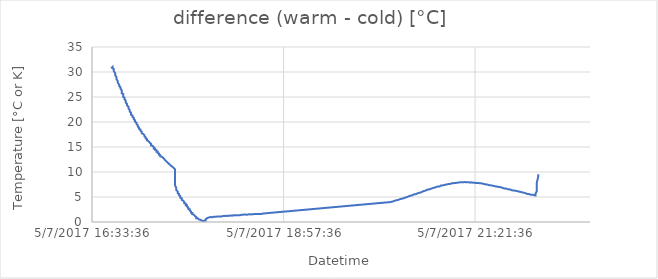
| Category | difference (warm - cold) [°C] |
|---|---|
| 42921.7 | 30.75 |
| 42921.700694444444 | 31 |
| 42921.700694444444 | 31 |
| 42921.700694444444 | 30.94 |
| 42921.700694444444 | 30.75 |
| 42921.70138888889 | 30.62 |
| 42921.70138888889 | 30.56 |
| 42921.70138888889 | 30.19 |
| 42921.70138888889 | 30 |
| 42921.70208333333 | 29.75 |
| 42921.70208333333 | 29.56 |
| 42921.70208333333 | 29.37 |
| 42921.70208333333 | 29.19 |
| 42921.70277777778 | 28.94 |
| 42921.70277777778 | 28.81 |
| 42921.70277777778 | 28.56 |
| 42921.70277777778 | 28.38 |
| 42921.70347222222 | 28.19 |
| 42921.70347222222 | 28 |
| 42921.70347222222 | 27.87 |
| 42921.70347222222 | 27.69 |
| 42921.70416666667 | 27.44 |
| 42921.70416666667 | 27.37 |
| 42921.70416666667 | 27.19 |
| 42921.70486111111 | 26.94 |
| 42921.70486111111 | 26.87 |
| 42921.70486111111 | 26.69 |
| 42921.70486111111 | 26.5 |
| 42921.705555555556 | 26.31 |
| 42921.705555555556 | 26.06 |
| 42921.705555555556 | 25.88 |
| 42921.705555555556 | 25.75 |
| 42921.70625 | 25.62 |
| 42921.70625 | 25.31 |
| 42921.70625 | 25.12 |
| 42921.70625 | 25 |
| 42921.70694444444 | 24.87 |
| 42921.70694444444 | 24.75 |
| 42921.70694444444 | 24.56 |
| 42921.70694444444 | 24.37 |
| 42921.70763888889 | 24.25 |
| 42921.70763888889 | 24.06 |
| 42921.70763888889 | 23.87 |
| 42921.70763888889 | 23.81 |
| 42921.708333333336 | 23.62 |
| 42921.708333333336 | 23.5 |
| 42921.708333333336 | 23.31 |
| 42921.708333333336 | 23.25 |
| 42921.709027777775 | 23.06 |
| 42921.709027777775 | 22.87 |
| 42921.709027777775 | 22.75 |
| 42921.709027777775 | 22.56 |
| 42921.70972222222 | 22.37 |
| 42921.70972222222 | 22.19 |
| 42921.70972222222 | 22.06 |
| 42921.71041666667 | 21.87 |
| 42921.71041666667 | 21.75 |
| 42921.71041666667 | 21.69 |
| 42921.71041666667 | 21.44 |
| 42921.71111111111 | 21.31 |
| 42921.71111111111 | 21.25 |
| 42921.71111111111 | 21.12 |
| 42921.71111111111 | 21 |
| 42921.711805555555 | 20.88 |
| 42921.711805555555 | 20.75 |
| 42921.711805555555 | 20.56 |
| 42921.711805555555 | 20.5 |
| 42921.7125 | 20.31 |
| 42921.7125 | 20.19 |
| 42921.7125 | 20.06 |
| 42921.7125 | 19.94 |
| 42921.71319444444 | 19.87 |
| 42921.71319444444 | 19.75 |
| 42921.71319444444 | 19.62 |
| 42921.71319444444 | 19.5 |
| 42921.71388888889 | 19.37 |
| 42921.71388888889 | 19.19 |
| 42921.71388888889 | 19.12 |
| 42921.71388888889 | 19 |
| 42921.714583333334 | 18.87 |
| 42921.714583333334 | 18.81 |
| 42921.714583333334 | 18.62 |
| 42921.714583333334 | 18.56 |
| 42921.71527777778 | 18.5 |
| 42921.71527777778 | 18.37 |
| 42921.71527777778 | 18.25 |
| 42921.71527777778 | 18.12 |
| 42921.71597222222 | 18.06 |
| 42921.71597222222 | 17.94 |
| 42921.71597222222 | 17.87 |
| 42921.71597222222 | 17.75 |
| 42921.71666666667 | 17.62 |
| 42921.71666666667 | 17.56 |
| 42921.71666666667 | 17.44 |
| 42921.717361111114 | 17.37 |
| 42921.717361111114 | 17.25 |
| 42921.717361111114 | 17.12 |
| 42921.717361111114 | 17.06 |
| 42921.71805555555 | 16.94 |
| 42921.71805555555 | 16.81 |
| 42921.71805555555 | 16.69 |
| 42921.71805555555 | 16.62 |
| 42921.71875 | 16.56 |
| 42921.71875 | 16.44 |
| 42921.71875 | 16.37 |
| 42921.71875 | 16.31 |
| 42921.71944444445 | 16.19 |
| 42921.71944444445 | 16.12 |
| 42921.71944444445 | 16.06 |
| 42921.71944444445 | 16 |
| 42921.720138888886 | 15.88 |
| 42921.720138888886 | 15.81 |
| 42921.720138888886 | 15.75 |
| 42921.720138888886 | 15.69 |
| 42921.72083333333 | 15.63 |
| 42921.72083333333 | 15.5 |
| 42921.72083333333 | 15.44 |
| 42921.72083333333 | 15.31 |
| 42921.72152777778 | 15.25 |
| 42921.72152777778 | 15.19 |
| 42921.72152777778 | 15.13 |
| 42921.72222222222 | 15 |
| 42921.72222222222 | 14.94 |
| 42921.72222222222 | 14.87 |
| 42921.72222222222 | 14.69 |
| 42921.722916666666 | 14.69 |
| 42921.722916666666 | 14.56 |
| 42921.722916666666 | 14.56 |
| 42921.722916666666 | 14.44 |
| 42921.72361111111 | 14.38 |
| 42921.72361111111 | 14.25 |
| 42921.72361111111 | 14.25 |
| 42921.72361111111 | 14.06 |
| 42921.72430555556 | 14.06 |
| 42921.72430555556 | 13.94 |
| 42921.72430555556 | 13.88 |
| 42921.72430555556 | 13.81 |
| 42921.725 | 13.69 |
| 42921.725 | 13.62 |
| 42921.725 | 13.56 |
| 42921.725 | 13.44 |
| 42921.725694444445 | 13.38 |
| 42921.725694444445 | 13.31 |
| 42921.725694444445 | 13.25 |
| 42921.725694444445 | 13.13 |
| 42921.72638888889 | 13.06 |
| 42921.72638888889 | 13 |
| 42921.72638888889 | 12.94 |
| 42921.72708333333 | 12.88 |
| 42921.72708333333 | 12.75 |
| 42921.72708333333 | 12.75 |
| 42921.72708333333 | 12.69 |
| 42921.72777777778 | 12.56 |
| 42921.72777777778 | 12.5 |
| 42921.72777777778 | 12.44 |
| 42921.72777777778 | 12.37 |
| 42921.728472222225 | 12.25 |
| 42921.728472222225 | 12.19 |
| 42921.728472222225 | 12.19 |
| 42921.728472222225 | 12.06 |
| 42921.729166666664 | 12 |
| 42921.729166666664 | 11.94 |
| 42921.729166666664 | 11.88 |
| 42921.729166666664 | 11.81 |
| 42921.72986111111 | 11.75 |
| 42921.72986111111 | 11.63 |
| 42921.72986111111 | 11.63 |
| 42921.72986111111 | 11.56 |
| 42921.73055555556 | 11.5 |
| 42921.73055555556 | 11.44 |
| 42921.73055555556 | 11.44 |
| 42921.73055555556 | 11.31 |
| 42921.73125 | 11.25 |
| 42921.73125 | 11.19 |
| 42921.73125 | 11.12 |
| 42921.73125 | 11.12 |
| 42921.731944444444 | 11.06 |
| 42921.731944444444 | 10.94 |
| 42921.731944444444 | 10.88 |
| 42921.73263888889 | 10.81 |
| 42921.73263888889 | 10.75 |
| 42921.73263888889 | 10.69 |
| 42921.73263888889 | 10.63 |
| 42921.73333333333 | 10.56 |
| 42921.73333333333 | 10.44 |
| 42921.73333333333 | 10.25 |
| 42921.73333333333 | 7.37 |
| 42921.73402777778 | 6.75 |
| 42921.73402777778 | 6.56 |
| 42921.73402777778 | 6.37 |
| 42921.73402777778 | 6.25 |
| 42921.73472222222 | 6.12 |
| 42921.73472222222 | 6 |
| 42921.73472222222 | 5.94 |
| 42921.73472222222 | 5.75 |
| 42921.73541666667 | 5.62 |
| 42921.73541666667 | 5.5 |
| 42921.73541666667 | 5.37 |
| 42921.73541666667 | 5.31 |
| 42921.73611111111 | 5.19 |
| 42921.73611111111 | 5.06 |
| 42921.73611111111 | 5 |
| 42921.73611111111 | 4.87 |
| 42921.736805555556 | 4.75 |
| 42921.736805555556 | 4.62 |
| 42921.736805555556 | 4.56 |
| 42921.736805555556 | 4.44 |
| 42921.7375 | 4.31 |
| 42921.7375 | 4.25 |
| 42921.7375 | 4.12 |
| 42921.73819444444 | 4 |
| 42921.73819444444 | 3.94 |
| 42921.73819444444 | 3.81 |
| 42921.73819444444 | 3.75 |
| 42921.73888888889 | 3.69 |
| 42921.73888888889 | 3.62 |
| 42921.73888888889 | 3.5 |
| 42921.73888888889 | 3.37 |
| 42921.739583333336 | 3.37 |
| 42921.739583333336 | 3.25 |
| 42921.739583333336 | 3.12 |
| 42921.739583333336 | 3 |
| 42921.740277777775 | 2.87 |
| 42921.740277777775 | 2.81 |
| 42921.740277777775 | 2.69 |
| 42921.740277777775 | 2.62 |
| 42921.74097222222 | 2.56 |
| 42921.74097222222 | 2.44 |
| 42921.74097222222 | 2.31 |
| 42921.74097222222 | 2.19 |
| 42921.74166666667 | 2.12 |
| 42921.74166666667 | 2.06 |
| 42921.74166666667 | 2 |
| 42921.74166666667 | 1.87 |
| 42921.74236111111 | 1.81 |
| 42921.74236111111 | 1.69 |
| 42921.74236111111 | 1.69 |
| 42921.74236111111 | 1.56 |
| 42921.743055555555 | 1.5 |
| 42921.743055555555 | 1.44 |
| 42921.743055555555 | 1.31 |
| 42921.74375 | 1.19 |
| 42921.74375 | 1.19 |
| 42921.74375 | 1.12 |
| 42921.74375 | 1.06 |
| 42921.74444444444 | 1 |
| 42921.74444444444 | 0.94 |
| 42921.74444444444 | 0.88 |
| 42921.74444444444 | 0.75 |
| 42921.74513888889 | 0.75 |
| 42921.74513888889 | 0.69 |
| 42921.74513888889 | 0.69 |
| 42921.74513888889 | 0.56 |
| 42921.745833333334 | 0.5 |
| 42921.745833333334 | 0.56 |
| 42921.745833333334 | 0.5 |
| 42921.745833333334 | 0.44 |
| 42921.74652777778 | 0.44 |
| 42921.74652777778 | 0.37 |
| 42921.74652777778 | 0.37 |
| 42921.74652777778 | 0.37 |
| 42921.74722222222 | 0.31 |
| 42921.74722222222 | 0.25 |
| 42921.74722222222 | 0.25 |
| 42921.74722222222 | 0.25 |
| 42921.74791666667 | 0.19 |
| 42921.74791666667 | 0.19 |
| 42921.74791666667 | 0.25 |
| 42921.74791666667 | 0.25 |
| 42921.748611111114 | 0.25 |
| 42921.748611111114 | 0.25 |
| 42921.748611111114 | 0.25 |
| 42921.748611111114 | 0.25 |
| 42921.74930555555 | 0.25 |
| 42921.74930555555 | 0.37 |
| 42921.74930555555 | 0.5 |
| 42921.74930555555 | 0.62 |
| 42921.75 | 0.75 |
| 42921.75 | 0.81 |
| 42921.75 | 0.81 |
| 42921.75 | 0.88 |
| 42921.75069444445 | 0.88 |
| 42921.75069444445 | 0.88 |
| 42921.75069444445 | 0.94 |
| 42921.751388888886 | 0.94 |
| 42921.751388888886 | 0.94 |
| 42921.751388888886 | 1 |
| 42921.751388888886 | 0.94 |
| 42921.75208333333 | 1 |
| 42921.75208333333 | 1 |
| 42921.75208333333 | 1 |
| 42921.75208333333 | 1 |
| 42921.75277777778 | 0.94 |
| 42921.75277777778 | 1 |
| 42921.75277777778 | 1 |
| 42921.75277777778 | 1 |
| 42921.75347222222 | 1.06 |
| 42921.75347222222 | 1 |
| 42921.75347222222 | 1 |
| 42921.75347222222 | 1 |
| 42921.754166666666 | 1.06 |
| 42921.754166666666 | 1.06 |
| 42921.754166666666 | 1.06 |
| 42921.754166666666 | 1.06 |
| 42921.75486111111 | 1.06 |
| 42921.75486111111 | 1.06 |
| 42921.75486111111 | 1.06 |
| 42921.75486111111 | 1.12 |
| 42921.75555555556 | 1.12 |
| 42921.75555555556 | 1.12 |
| 42921.75555555556 | 1.12 |
| 42921.75625 | 1.12 |
| 42921.75625 | 1.12 |
| 42921.75625 | 1.12 |
| 42921.75625 | 1.19 |
| 42921.756944444445 | 1.12 |
| 42921.756944444445 | 1.19 |
| 42921.756944444445 | 1.19 |
| 42921.756944444445 | 1.19 |
| 42921.75763888889 | 1.12 |
| 42921.75763888889 | 1.12 |
| 42921.75763888889 | 1.19 |
| 42921.75763888889 | 1.19 |
| 42921.75833333333 | 1.19 |
| 42921.75833333333 | 1.19 |
| 42921.75833333333 | 1.19 |
| 42921.75833333333 | 1.19 |
| 42921.75902777778 | 1.19 |
| 42921.75902777778 | 1.19 |
| 42921.75902777778 | 1.19 |
| 42921.75902777778 | 1.25 |
| 42921.759722222225 | 1.25 |
| 42921.759722222225 | 1.25 |
| 42921.759722222225 | 1.19 |
| 42921.759722222225 | 1.25 |
| 42921.760416666664 | 1.19 |
| 42921.760416666664 | 1.19 |
| 42921.760416666664 | 1.31 |
| 42921.760416666664 | 1.25 |
| 42921.76111111111 | 1.25 |
| 42921.76111111111 | 1.25 |
| 42921.76111111111 | 1.25 |
| 42921.76111111111 | 1.25 |
| 42921.76180555556 | 1.25 |
| 42921.76180555556 | 1.25 |
| 42921.76180555556 | 1.31 |
| 42921.76180555556 | 1.31 |
| 42921.7625 | 1.31 |
| 42921.7625 | 1.31 |
| 42921.7625 | 1.31 |
| 42921.7625 | 1.31 |
| 42921.763194444444 | 1.25 |
| 42921.763194444444 | 1.31 |
| 42921.763194444444 | 1.31 |
| 42921.76388888889 | 1.37 |
| 42921.76388888889 | 1.31 |
| 42921.76388888889 | 1.31 |
| 42921.76388888889 | 1.37 |
| 42921.76458333333 | 1.31 |
| 42921.76458333333 | 1.31 |
| 42921.76458333333 | 1.31 |
| 42921.76458333333 | 1.37 |
| 42921.76527777778 | 1.37 |
| 42921.76527777778 | 1.37 |
| 42921.76527777778 | 1.37 |
| 42921.76527777778 | 1.37 |
| 42921.76597222222 | 1.37 |
| 42921.76597222222 | 1.37 |
| 42921.76597222222 | 1.37 |
| 42921.76597222222 | 1.37 |
| 42921.76666666667 | 1.37 |
| 42921.76666666667 | 1.44 |
| 42921.76666666667 | 1.44 |
| 42921.76666666667 | 1.37 |
| 42921.76736111111 | 1.37 |
| 42921.76736111111 | 1.44 |
| 42921.76736111111 | 1.37 |
| 42921.76736111111 | 1.5 |
| 42921.768055555556 | 1.44 |
| 42921.768055555556 | 1.44 |
| 42921.768055555556 | 1.44 |
| 42921.768055555556 | 1.44 |
| 42921.76875 | 1.44 |
| 42921.76875 | 1.44 |
| 42921.76875 | 1.44 |
| 42921.76944444444 | 1.5 |
| 42921.76944444444 | 1.5 |
| 42921.76944444444 | 1.5 |
| 42921.76944444444 | 1.5 |
| 42921.77013888889 | 1.5 |
| 42921.77013888889 | 1.5 |
| 42921.77013888889 | 1.5 |
| 42921.77013888889 | 1.44 |
| 42921.770833333336 | 1.44 |
| 42921.770833333336 | 1.5 |
| 42921.770833333336 | 1.5 |
| 42921.770833333336 | 1.5 |
| 42921.771527777775 | 1.5 |
| 42921.771527777775 | 1.5 |
| 42921.771527777775 | 1.5 |
| 42921.771527777775 | 1.5 |
| 42921.77222222222 | 1.56 |
| 42921.77222222222 | 1.56 |
| 42921.77222222222 | 1.56 |
| 42921.77222222222 | 1.56 |
| 42921.77291666667 | 1.5 |
| 42921.77291666667 | 1.5 |
| 42921.77291666667 | 1.5 |
| 42921.77291666667 | 1.56 |
| 42921.77361111111 | 1.56 |
| 42921.77361111111 | 1.56 |
| 42921.77361111111 | 1.56 |
| 42921.774305555555 | 1.56 |
| 42921.774305555555 | 1.56 |
| 42921.774305555555 | 1.56 |
| 42921.774305555555 | 1.56 |
| 42921.775 | 1.62 |
| 42921.775 | 1.62 |
| 42921.775 | 1.62 |
| 42921.775 | 1.56 |
| 42921.77569444444 | 1.62 |
| 42921.77569444444 | 1.56 |
| 42921.77569444444 | 1.56 |
| 42921.77569444444 | 1.62 |
| 42921.77638888889 | 1.62 |
| 42921.77638888889 | 1.62 |
| 42921.77638888889 | 1.62 |
| 42921.77638888889 | 1.62 |
| 42921.777083333334 | 1.62 |
| 42921.777083333334 | 1.62 |
| 42921.777083333334 | 1.69 |
| 42921.77777777778 | 1.62 |
| 42921.77777777778 | 1.62 |
| 42921.77777777778 | 1.62 |
| 42921.77777777778 | 1.62 |
| 42921.77847222222 | 1.62 |
| 42921.77847222222 | 1.62 |
| 42921.77847222222 | 1.62 |
| 42921.77847222222 | 1.69 |
| 42921.77916666667 | 1.69 |
| 42921.84444444445 | 3.94 |
| 42921.845138888886 | 3.94 |
| 42921.845138888886 | 3.87 |
| 42921.845138888886 | 3.94 |
| 42921.845138888886 | 4 |
| 42921.84583333333 | 4 |
| 42921.84583333333 | 4 |
| 42921.84583333333 | 4 |
| 42921.84583333333 | 4.06 |
| 42921.84652777778 | 4.06 |
| 42921.84652777778 | 4.12 |
| 42921.84652777778 | 4.06 |
| 42921.84652777778 | 4.12 |
| 42921.84722222222 | 4.12 |
| 42921.84722222222 | 4.19 |
| 42921.84722222222 | 4.12 |
| 42921.84722222222 | 4.19 |
| 42921.847916666666 | 4.25 |
| 42921.847916666666 | 4.25 |
| 42921.847916666666 | 4.25 |
| 42921.847916666666 | 4.25 |
| 42921.84861111111 | 4.31 |
| 42921.84861111111 | 4.31 |
| 42921.84861111111 | 4.37 |
| 42921.84861111111 | 4.31 |
| 42921.84930555556 | 4.37 |
| 42921.84930555556 | 4.44 |
| 42921.84930555556 | 4.44 |
| 42921.84930555556 | 4.5 |
| 42921.85 | 4.44 |
| 42921.85 | 4.5 |
| 42921.85 | 4.5 |
| 42921.85 | 4.5 |
| 42921.850694444445 | 4.56 |
| 42921.850694444445 | 4.56 |
| 42921.850694444445 | 4.62 |
| 42921.850694444445 | 4.62 |
| 42921.85138888889 | 4.62 |
| 42921.85138888889 | 4.62 |
| 42921.85138888889 | 4.69 |
| 42921.85208333333 | 4.69 |
| 42921.85208333333 | 4.69 |
| 42921.85208333333 | 4.75 |
| 42921.85208333333 | 4.81 |
| 42921.85277777778 | 4.75 |
| 42921.85277777778 | 4.81 |
| 42921.85277777778 | 4.81 |
| 42921.85277777778 | 4.81 |
| 42921.853472222225 | 4.87 |
| 42921.853472222225 | 4.87 |
| 42921.853472222225 | 4.94 |
| 42921.853472222225 | 4.94 |
| 42921.854166666664 | 4.94 |
| 42921.854166666664 | 5 |
| 42921.854166666664 | 5 |
| 42921.854166666664 | 5 |
| 42921.85486111111 | 5.06 |
| 42921.85486111111 | 5.06 |
| 42921.85486111111 | 5.06 |
| 42921.85486111111 | 5.12 |
| 42921.85555555556 | 5.19 |
| 42921.85555555556 | 5.19 |
| 42921.85555555556 | 5.19 |
| 42921.85555555556 | 5.19 |
| 42921.85625 | 5.25 |
| 42921.85625 | 5.31 |
| 42921.85625 | 5.25 |
| 42921.856944444444 | 5.31 |
| 42921.856944444444 | 5.31 |
| 42921.856944444444 | 5.31 |
| 42921.856944444444 | 5.37 |
| 42921.85763888889 | 5.44 |
| 42921.85763888889 | 5.37 |
| 42921.85763888889 | 5.44 |
| 42921.85763888889 | 5.5 |
| 42921.85833333333 | 5.56 |
| 42921.85833333333 | 5.5 |
| 42921.85833333333 | 5.56 |
| 42921.85833333333 | 5.62 |
| 42921.85902777778 | 5.56 |
| 42921.85902777778 | 5.62 |
| 42921.85902777778 | 5.69 |
| 42921.85902777778 | 5.62 |
| 42921.85972222222 | 5.69 |
| 42921.85972222222 | 5.75 |
| 42921.85972222222 | 5.81 |
| 42921.85972222222 | 5.75 |
| 42921.86041666667 | 5.81 |
| 42921.86041666667 | 5.81 |
| 42921.86041666667 | 5.87 |
| 42921.86041666667 | 5.94 |
| 42921.86111111111 | 5.87 |
| 42921.86111111111 | 5.94 |
| 42921.86111111111 | 5.94 |
| 42921.861805555556 | 5.94 |
| 42921.861805555556 | 6 |
| 42921.861805555556 | 6 |
| 42921.861805555556 | 6 |
| 42921.8625 | 6.06 |
| 42921.8625 | 6.12 |
| 42921.8625 | 6.06 |
| 42921.8625 | 6.12 |
| 42921.86319444444 | 6.19 |
| 42921.86319444444 | 6.12 |
| 42921.86319444444 | 6.19 |
| 42921.86319444444 | 6.25 |
| 42921.86388888889 | 6.25 |
| 42921.86388888889 | 6.25 |
| 42921.86388888889 | 6.31 |
| 42921.86388888889 | 6.31 |
| 42921.864583333336 | 6.37 |
| 42921.864583333336 | 6.37 |
| 42921.864583333336 | 6.37 |
| 42921.864583333336 | 6.44 |
| 42921.865277777775 | 6.5 |
| 42921.865277777775 | 6.44 |
| 42921.865277777775 | 6.5 |
| 42921.865277777775 | 6.5 |
| 42921.86597222222 | 6.5 |
| 42921.86597222222 | 6.56 |
| 42921.86597222222 | 6.62 |
| 42921.86597222222 | 6.56 |
| 42921.86666666667 | 6.62 |
| 42921.86666666667 | 6.69 |
| 42921.86666666667 | 6.69 |
| 42921.86666666667 | 6.69 |
| 42921.86736111111 | 6.69 |
| 42921.86736111111 | 6.75 |
| 42921.86736111111 | 6.81 |
| 42921.86736111111 | 6.75 |
| 42921.868055555555 | 6.81 |
| 42921.868055555555 | 6.81 |
| 42921.868055555555 | 6.87 |
| 42921.868055555555 | 6.87 |
| 42921.86875 | 6.87 |
| 42921.86875 | 6.94 |
| 42921.86875 | 6.94 |
| 42921.86944444444 | 6.94 |
| 42921.86944444444 | 7 |
| 42921.86944444444 | 7 |
| 42921.86944444444 | 7 |
| 42921.87013888889 | 7.06 |
| 42921.87013888889 | 7.06 |
| 42921.87013888889 | 7.06 |
| 42921.87013888889 | 7.06 |
| 42921.870833333334 | 7.12 |
| 42921.870833333334 | 7.12 |
| 42921.870833333334 | 7.12 |
| 42921.870833333334 | 7.19 |
| 42921.87152777778 | 7.12 |
| 42921.87152777778 | 7.19 |
| 42921.87152777778 | 7.19 |
| 42921.87152777778 | 7.25 |
| 42921.87222222222 | 7.31 |
| 42921.87222222222 | 7.25 |
| 42921.87222222222 | 7.31 |
| 42921.87222222222 | 7.31 |
| 42921.87291666667 | 7.31 |
| 42921.87291666667 | 7.31 |
| 42921.87291666667 | 7.37 |
| 42921.87291666667 | 7.31 |
| 42921.873611111114 | 7.37 |
| 42921.873611111114 | 7.37 |
| 42921.873611111114 | 7.37 |
| 42921.873611111114 | 7.44 |
| 42921.87430555555 | 7.44 |
| 42921.87430555555 | 7.5 |
| 42921.87430555555 | 7.5 |
| 42921.87430555555 | 7.5 |
| 42921.875 | 7.5 |
| 42921.875 | 7.56 |
| 42921.875 | 7.5 |
| 42921.87569444445 | 7.56 |
| 42921.87569444445 | 7.62 |
| 42921.87569444445 | 7.62 |
| 42921.87569444445 | 7.62 |
| 42921.876388888886 | 7.62 |
| 42921.876388888886 | 7.69 |
| 42921.876388888886 | 7.62 |
| 42921.876388888886 | 7.69 |
| 42921.87708333333 | 7.62 |
| 42921.87708333333 | 7.69 |
| 42921.87708333333 | 7.69 |
| 42921.87708333333 | 7.69 |
| 42921.87777777778 | 7.75 |
| 42921.87777777778 | 7.75 |
| 42921.87777777778 | 7.69 |
| 42921.87777777778 | 7.75 |
| 42921.87847222222 | 7.75 |
| 42921.87847222222 | 7.75 |
| 42921.87847222222 | 7.81 |
| 42921.87847222222 | 7.75 |
| 42921.879166666666 | 7.81 |
| 42921.879166666666 | 7.81 |
| 42921.879166666666 | 7.81 |
| 42921.879166666666 | 7.81 |
| 42921.87986111111 | 7.81 |
| 42921.87986111111 | 7.81 |
| 42921.87986111111 | 7.87 |
| 42921.87986111111 | 7.87 |
| 42921.88055555556 | 7.87 |
| 42921.88055555556 | 7.87 |
| 42921.88055555556 | 7.87 |
| 42921.88055555556 | 7.87 |
| 42921.88125 | 7.87 |
| 42921.88125 | 7.94 |
| 42921.88125 | 7.87 |
| 42921.881944444445 | 7.94 |
| 42921.881944444445 | 7.87 |
| 42921.881944444445 | 7.94 |
| 42921.881944444445 | 7.87 |
| 42921.88263888889 | 7.94 |
| 42921.88263888889 | 7.87 |
| 42921.88263888889 | 7.94 |
| 42921.88263888889 | 7.94 |
| 42921.88333333333 | 7.94 |
| 42921.88333333333 | 7.94 |
| 42921.88333333333 | 7.94 |
| 42921.88333333333 | 7.94 |
| 42921.88402777778 | 7.94 |
| 42921.88402777778 | 7.94 |
| 42921.88402777778 | 8 |
| 42921.88402777778 | 7.94 |
| 42921.884722222225 | 8 |
| 42921.884722222225 | 7.94 |
| 42921.884722222225 | 7.87 |
| 42921.884722222225 | 7.94 |
| 42921.885416666664 | 7.94 |
| 42921.885416666664 | 7.94 |
| 42921.885416666664 | 7.94 |
| 42921.885416666664 | 7.87 |
| 42921.88611111111 | 7.94 |
| 42921.88611111111 | 7.94 |
| 42921.88611111111 | 7.94 |
| 42921.88611111111 | 7.87 |
| 42921.88680555556 | 7.94 |
| 42921.88680555556 | 7.94 |
| 42921.88680555556 | 7.87 |
| 42921.88680555556 | 7.94 |
| 42921.8875 | 7.87 |
| 42921.8875 | 7.94 |
| 42921.8875 | 7.94 |
| 42921.8875 | 7.87 |
| 42921.888194444444 | 7.94 |
| 42921.888194444444 | 7.87 |
| 42921.888194444444 | 7.87 |
| 42921.888194444444 | 7.94 |
| 42921.88888888889 | 7.87 |
| 42921.88888888889 | 7.87 |
| 42921.88888888889 | 7.87 |
| 42921.88958333333 | 7.87 |
| 42921.88958333333 | 7.81 |
| 42921.88958333333 | 7.87 |
| 42921.88958333333 | 7.81 |
| 42921.89027777778 | 7.81 |
| 42921.89027777778 | 7.87 |
| 42921.89027777778 | 7.81 |
| 42921.89027777778 | 7.81 |
| 42921.89097222222 | 7.81 |
| 42921.89097222222 | 7.81 |
| 42921.89097222222 | 7.81 |
| 42921.89097222222 | 7.75 |
| 42921.89166666667 | 7.81 |
| 42921.89166666667 | 7.75 |
| 42921.89166666667 | 7.75 |
| 42921.89166666667 | 7.75 |
| 42921.89236111111 | 7.75 |
| 42921.89236111111 | 7.75 |
| 42921.89236111111 | 7.69 |
| 42921.89236111111 | 7.69 |
| 42921.893055555556 | 7.75 |
| 42921.893055555556 | 7.69 |
| 42921.893055555556 | 7.69 |
| 42921.893055555556 | 7.69 |
| 42921.89375 | 7.69 |
| 42921.89375 | 7.69 |
| 42921.89375 | 7.62 |
| 42921.89375 | 7.62 |
| 42921.89444444444 | 7.62 |
| 42921.89444444444 | 7.62 |
| 42921.89444444444 | 7.62 |
| 42921.89444444444 | 7.56 |
| 42921.89513888889 | 7.56 |
| 42921.89513888889 | 7.56 |
| 42921.89513888889 | 7.56 |
| 42921.895833333336 | 7.5 |
| 42921.895833333336 | 7.5 |
| 42921.895833333336 | 7.5 |
| 42921.895833333336 | 7.5 |
| 42921.896527777775 | 7.5 |
| 42921.896527777775 | 7.5 |
| 42921.896527777775 | 7.44 |
| 42921.896527777775 | 7.44 |
| 42921.89722222222 | 7.37 |
| 42921.89722222222 | 7.44 |
| 42921.89722222222 | 7.44 |
| 42921.89722222222 | 7.37 |
| 42921.89791666667 | 7.37 |
| 42921.89791666667 | 7.37 |
| 42921.89791666667 | 7.31 |
| 42921.89791666667 | 7.31 |
| 42921.89861111111 | 7.31 |
| 42921.89861111111 | 7.31 |
| 42921.89861111111 | 7.31 |
| 42921.89861111111 | 7.25 |
| 42921.899305555555 | 7.25 |
| 42921.899305555555 | 7.25 |
| 42921.899305555555 | 7.25 |
| 42921.899305555555 | 7.19 |
| 42921.9 | 7.19 |
| 42921.9 | 7.19 |
| 42921.9 | 7.19 |
| 42921.90069444444 | 7.12 |
| 42921.90069444444 | 7.12 |
| 42921.90069444444 | 7.12 |
| 42921.90069444444 | 7.12 |
| 42921.90138888889 | 7.12 |
| 42921.90138888889 | 7.06 |
| 42921.90138888889 | 7.06 |
| 42921.90138888889 | 7.06 |
| 42921.902083333334 | 7 |
| 42921.902083333334 | 7.06 |
| 42921.902083333334 | 7 |
| 42921.902083333334 | 7 |
| 42921.90277777778 | 7 |
| 42921.90277777778 | 6.94 |
| 42921.90277777778 | 6.94 |
| 42921.90277777778 | 6.94 |
| 42921.90347222222 | 6.94 |
| 42921.90347222222 | 6.94 |
| 42921.90347222222 | 6.87 |
| 42921.90347222222 | 6.87 |
| 42921.90416666667 | 6.87 |
| 42921.90416666667 | 6.81 |
| 42921.90416666667 | 6.81 |
| 42921.90416666667 | 6.75 |
| 42921.904861111114 | 6.75 |
| 42921.904861111114 | 6.81 |
| 42921.904861111114 | 6.75 |
| 42921.904861111114 | 6.75 |
| 42921.90555555555 | 6.69 |
| 42921.90555555555 | 6.69 |
| 42921.90555555555 | 6.62 |
| 42921.90555555555 | 6.69 |
| 42921.90625 | 6.69 |
| 42921.90625 | 6.62 |
| 42921.90625 | 6.69 |
| 42921.90625 | 6.62 |
| 42921.90694444445 | 6.56 |
| 42921.90694444445 | 6.56 |
| 42921.90694444445 | 6.56 |
| 42921.90694444445 | 6.56 |
| 42921.907638888886 | 6.56 |
| 42921.907638888886 | 6.5 |
| 42921.907638888886 | 6.5 |
| 42921.90833333333 | 6.5 |
| 42921.90833333333 | 6.5 |
| 42921.90833333333 | 6.5 |
| 42921.90833333333 | 6.44 |
| 42921.90902777778 | 6.37 |
| 42921.90902777778 | 6.44 |
| 42921.90902777778 | 6.37 |
| 42921.90902777778 | 6.37 |
| 42921.90972222222 | 6.31 |
| 42921.90972222222 | 6.37 |
| 42921.90972222222 | 6.37 |
| 42921.90972222222 | 6.31 |
| 42921.910416666666 | 6.31 |
| 42921.910416666666 | 6.31 |
| 42921.910416666666 | 6.31 |
| 42921.910416666666 | 6.25 |
| 42921.91111111111 | 6.25 |
| 42921.91111111111 | 6.25 |
| 42921.91111111111 | 6.25 |
| 42921.91111111111 | 6.19 |
| 42921.91180555556 | 6.19 |
| 42921.91180555556 | 6.12 |
| 42921.91180555556 | 6.19 |
| 42921.91180555556 | 6.12 |
| 42921.9125 | 6.12 |
| 42921.9125 | 6.06 |
| 42921.9125 | 6.06 |
| 42921.9125 | 6.06 |
| 42921.913194444445 | 6.06 |
| 42921.913194444445 | 6 |
| 42921.913194444445 | 6.06 |
| 42921.913194444445 | 6 |
| 42921.91388888889 | 6 |
| 42921.91388888889 | 5.94 |
| 42921.91388888889 | 5.94 |
| 42921.91458333333 | 5.94 |
| 42921.91458333333 | 5.94 |
| 42921.91458333333 | 5.87 |
| 42921.91458333333 | 5.87 |
| 42921.91527777778 | 5.87 |
| 42921.91527777778 | 5.87 |
| 42921.91527777778 | 5.81 |
| 42921.91527777778 | 5.81 |
| 42921.915972222225 | 5.81 |
| 42921.915972222225 | 5.81 |
| 42921.915972222225 | 5.75 |
| 42921.915972222225 | 5.75 |
| 42921.916666666664 | 5.69 |
| 42921.916666666664 | 5.75 |
| 42921.916666666664 | 5.69 |
| 42921.916666666664 | 5.69 |
| 42921.91736111111 | 5.62 |
| 42921.91736111111 | 5.69 |
| 42921.91736111111 | 5.62 |
| 42921.91736111111 | 5.62 |
| 42921.91805555556 | 5.62 |
| 42921.91805555556 | 5.62 |
| 42921.91805555556 | 5.56 |
| 42921.91805555556 | 5.56 |
| 42921.91875 | 5.5 |
| 42921.91875 | 5.56 |
| 42921.91875 | 5.5 |
| 42921.91875 | 5.5 |
| 42921.919444444444 | 5.44 |
| 42921.919444444444 | 5.5 |
| 42921.919444444444 | 5.44 |
| 42921.92013888889 | 5.44 |
| 42921.92013888889 | 5.37 |
| 42921.92013888889 | 5.37 |
| 42921.92013888889 | 5.37 |
| 42921.92083333333 | 5.37 |
| 42921.92083333333 | 5.31 |
| 42921.92083333333 | 5.31 |
| 42921.92083333333 | 5.31 |
| 42921.92152777778 | 5.31 |
| 42921.92152777778 | 5.31 |
| 42921.92152777778 | 5.25 |
| 42921.92152777778 | 5.62 |
| 42921.92222222222 | 6.19 |
| 42921.92222222222 | 6.75 |
| 42921.92222222222 | 7.37 |
| 42921.92222222222 | 7.87 |
| 42921.92291666667 | 9 |
| 42921.92291666667 | 9.56 |